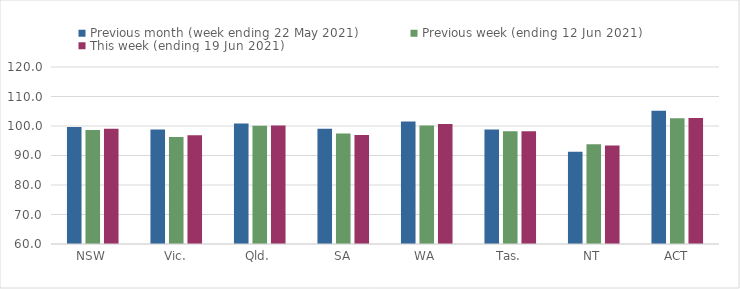
| Category | Previous month (week ending 22 May 2021) | Previous week (ending 12 Jun 2021) | This week (ending 19 Jun 2021) |
|---|---|---|---|
| NSW | 99.66 | 98.68 | 99.07 |
| Vic. | 98.81 | 96.25 | 96.9 |
| Qld. | 100.87 | 100.1 | 100.14 |
| SA | 99.11 | 97.47 | 96.94 |
| WA | 101.55 | 100.17 | 100.68 |
| Tas. | 98.85 | 98.25 | 98.25 |
| NT | 91.27 | 93.84 | 93.36 |
| ACT | 105.19 | 102.59 | 102.72 |